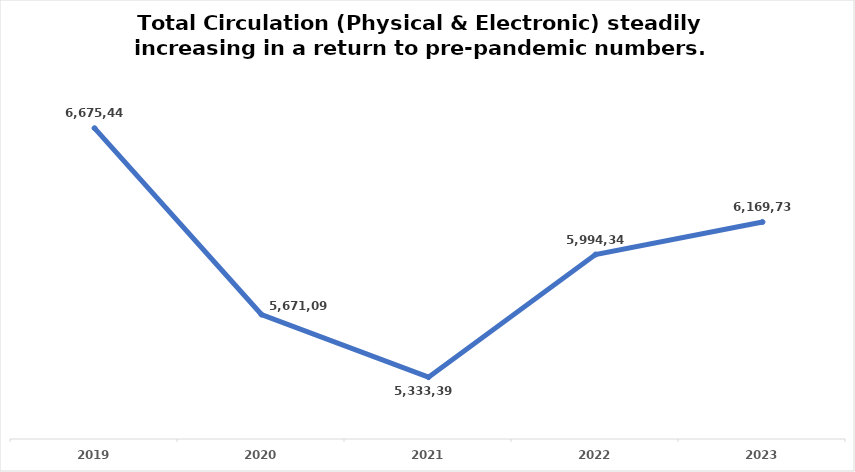
| Category | Series 0 |
|---|---|
| 2019.0 | 6675444 |
| 2020.0 | 5671090 |
| 2021.0 | 5333392 |
| 2022.0 | 5994346 |
| 2023.0 | 6169737 |